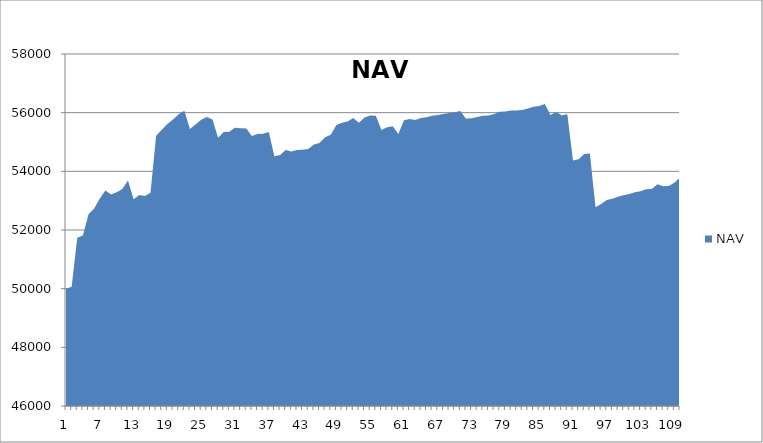
| Category | NAV |
|---|---|
| 0 | 50000 |
| 1 | 50069.444 |
| 2 | 51736.444 |
| 3 | 51809.343 |
| 4 | 52539.343 |
| 5 | 52733.57 |
| 6 | 53070.527 |
| 7 | 53346.212 |
| 8 | 53210.13 |
| 9 | 53285.788 |
| 10 | 53396.685 |
| 11 | 53684.185 |
| 12 | 53050.597 |
| 13 | 53191.058 |
| 14 | 53162.649 |
| 15 | 53270.317 |
| 16 | 55214.762 |
| 17 | 55418.583 |
| 18 | 55617.273 |
| 19 | 55770.477 |
| 20 | 55945.477 |
| 21 | 56069.601 |
| 22 | 55444.601 |
| 23 | 55597.925 |
| 24 | 55757.558 |
| 25 | 55851.308 |
| 26 | 55764.06 |
| 27 | 55148.361 |
| 28 | 55340.028 |
| 29 | 55349.317 |
| 30 | 55485.393 |
| 31 | 55468.704 |
| 32 | 55461.038 |
| 33 | 55205.356 |
| 34 | 55270.356 |
| 35 | 55282.57 |
| 36 | 55341.011 |
| 37 | 54517.482 |
| 38 | 54554.291 |
| 39 | 54731.016 |
| 40 | 54679.093 |
| 41 | 54730.595 |
| 42 | 54736.73 |
| 43 | 54765.085 |
| 44 | 54915.643 |
| 45 | 54969.86 |
| 46 | 55164.665 |
| 47 | 55247.746 |
| 48 | 55575.668 |
| 49 | 55657.905 |
| 50 | 55701.032 |
| 51 | 55819.28 |
| 52 | 55652.834 |
| 53 | 55838.604 |
| 54 | 55905.769 |
| 55 | 55898.888 |
| 56 | 55410.9 |
| 57 | 55504.564 |
| 58 | 55537.603 |
| 59 | 55268.471 |
| 60 | 55737.858 |
| 61 | 55785.708 |
| 62 | 55749.829 |
| 63 | 55815.591 |
| 64 | 55842.34 |
| 65 | 55894.021 |
| 66 | 55916.828 |
| 67 | 55955.697 |
| 68 | 55991.896 |
| 69 | 56012.065 |
| 70 | 56060.293 |
| 71 | 55791.443 |
| 72 | 55810.674 |
| 73 | 55852.843 |
| 74 | 55892.018 |
| 75 | 55900.069 |
| 76 | 55955.739 |
| 77 | 56030.918 |
| 78 | 56036.168 |
| 79 | 56069.975 |
| 80 | 56071.656 |
| 81 | 56090.406 |
| 82 | 56141.798 |
| 83 | 56199.159 |
| 84 | 56228.237 |
| 85 | 56292.573 |
| 86 | 55924.369 |
| 87 | 56019.106 |
| 88 | 55916.165 |
| 89 | 55950.09 |
| 90 | 54367.13 |
| 91 | 54411.811 |
| 92 | 54588.933 |
| 93 | 54611.197 |
| 94 | 52777.117 |
| 95 | 52883.107 |
| 96 | 53025.651 |
| 97 | 53064.908 |
| 98 | 53135.652 |
| 99 | 53186.005 |
| 100 | 53229.789 |
| 101 | 53290.192 |
| 102 | 53319.038 |
| 103 | 53392.112 |
| 104 | 53401.462 |
| 105 | 53559.878 |
| 106 | 53489.526 |
| 107 | 53501.684 |
| 108 | 53607.597 |
| 109 | 53785.178 |